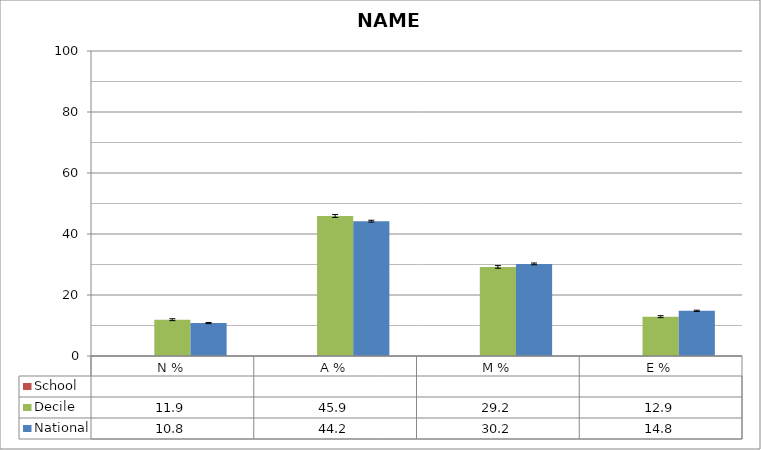
| Category | School  | Decile | National |
|---|---|---|---|
| N % |  | 11.9 | 10.8 |
| A % |  | 45.9 | 44.2 |
| M % |  | 29.2 | 30.2 |
| E % |  | 12.9 | 14.8 |